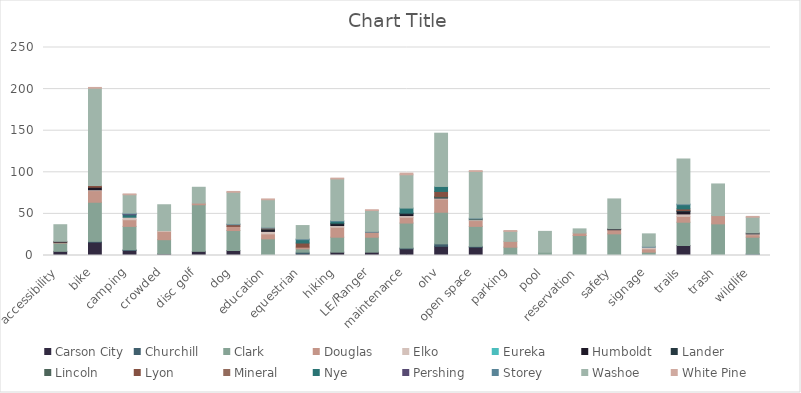
| Category | Carson City | Churchill | Clark | Douglas | Elko | Eureka | Humboldt | Lander | Lincoln | Lyon | Mineral | Nye | Pershing | Storey | Washoe | White Pine |
|---|---|---|---|---|---|---|---|---|---|---|---|---|---|---|---|---|
| accessibility | 5 | 0 | 10 | 1 | 0 | 0 | 1 | 0 | 0 | 0 | 0 | 0 | 0 | 0 | 20 | 0 |
| bike | 16 | 1 | 47 | 14 | 1 | 0 | 3 | 0 | 0 | 2 | 0 | 0 | 0 | 0 | 117 | 1 |
| camping | 6 | 1 | 28 | 8 | 3 | 0 | 0 | 0 | 0 | 0 | 0 | 3 | 1 | 1 | 22 | 1 |
| crowded | 2 | 0 | 17 | 10 | 1 | 0 | 0 | 0 | 0 | 0 | 0 | 0 | 0 | 0 | 31 | 0 |
| disc golf | 5 | 0 | 56 | 2 | 0 | 0 | 0 | 0 | 0 | 0 | 0 | 0 | 0 | 0 | 19 | 0 |
| dog | 6 | 0 | 24 | 5 | 0 | 0 | 0 | 0 | 0 | 2 | 0 | 0 | 0 | 1 | 38 | 1 |
| education | 1 | 0 | 19 | 6 | 3 | 0 | 2 | 1 | 0 | 0 | 1 | 0 | 0 | 1 | 33 | 1 |
| equestrian | 2 | 2 | 4 | 2 | 0 | 0 | 0 | 0 | 0 | 5 | 0 | 4 | 0 | 1 | 16 | 0 |
| hiking | 4 | 0 | 18 | 12 | 2 | 0 | 2 | 1 | 0 | 0 | 0 | 2 | 0 | 1 | 50 | 1 |
| LE/Ranger | 4 | 0 | 18 | 6 | 0 | 0 | 0 | 0 | 0 | 0 | 0 | 0 | 0 | 1 | 25 | 1 |
| maintenance | 8 | 1 | 30 | 7 | 2 | 0 | 2 | 1 | 0 | 0 | 0 | 6 | 0 | 0 | 40 | 2 |
| ohv | 11 | 3 | 38 | 16 | 1 | 0 | 0 | 1 | 1 | 6 | 0 | 6 | 0 | 0 | 64 | 0 |
| open space | 10 | 1 | 24 | 7 | 1 | 0 | 0 | 0 | 1 | 0 | 0 | 0 | 0 | 1 | 56 | 1 |
| parking | 1 | 0 | 9 | 7 | 0 | 0 | 0 | 0 | 0 | 0 | 0 | 0 | 0 | 0 | 12 | 1 |
| pool | 0 | 0 | 4 | 0 | 0 | 0 | 0 | 0 | 0 | 0 | 0 | 0 | 0 | 0 | 25 | 0 |
| reservation | 0 | 0 | 24 | 3 | 0 | 0 | 0 | 0 | 0 | 0 | 0 | 0 | 0 | 0 | 5 | 0 |
| safety | 0 | 0 | 26 | 5 | 0 | 0 | 1 | 0 | 0 | 0 | 0 | 0 | 0 | 0 | 36 | 0 |
| signage | 0 | 0 | 4 | 4 | 2 | 0 | 0 | 0 | 0 | 0 | 0 | 0 | 0 | 1 | 15 | 0 |
| trails | 12 | 0 | 28 | 7 | 3 | 0 | 3 | 1 | 0 | 2 | 0 | 5 | 0 | 1 | 54 | 0 |
| trash | 1 | 0 | 37 | 10 | 0 | 0 | 0 | 0 | 0 | 0 | 0 | 0 | 0 | 0 | 38 | 0 |
| wildlife | 1 | 1 | 20 | 3 | 1 | 0 | 1 | 0 | 0 | 0 | 0 | 0 | 0 | 0 | 19 | 1 |